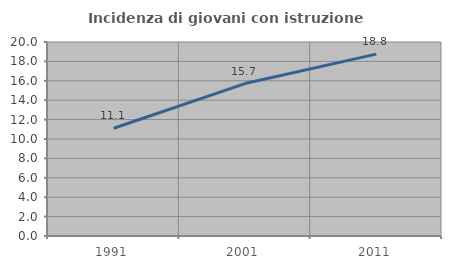
| Category | Incidenza di giovani con istruzione universitaria |
|---|---|
| 1991.0 | 11.111 |
| 2001.0 | 15.714 |
| 2011.0 | 18.75 |